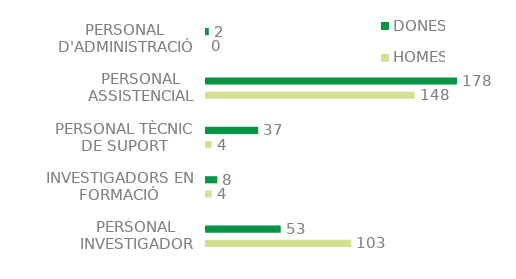
| Category | HOMES | DONES |
|---|---|---|
| PERSONAL INVESTIGADOR | 103 | 53 |
| INVESTIGADORS EN FORMACIÓ | 4 | 8 |
| PERSONAL TÈCNIC DE SUPORT | 4 | 37 |
| PERSONAL ASSISTENCIAL | 148 | 178 |
| PERSONAL D'ADMINISTRACIÓ | 0 | 2 |